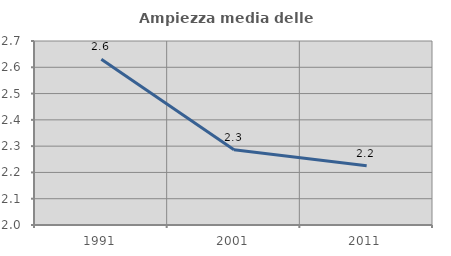
| Category | Ampiezza media delle famiglie |
|---|---|
| 1991.0 | 2.63 |
| 2001.0 | 2.286 |
| 2011.0 | 2.225 |